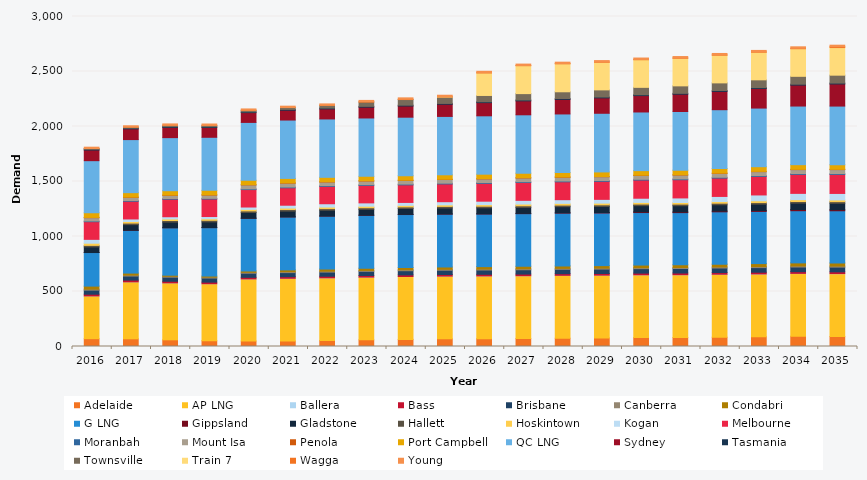
| Category | Adelaide | AP LNG | Ballera | Bass | Brisbane | Canberra | Condabri | G LNG | Gippsland | Gladstone | Hallett | Hoskintown | Kogan | Melbourne | Moranbah | Mount Isa | Penola | Port Campbell | QC LNG | Sydney | Tasmania | Townsville | Train 7 | Wagga | Young |
|---|---|---|---|---|---|---|---|---|---|---|---|---|---|---|---|---|---|---|---|---|---|---|---|---|---|
| 2016.0 | 71.128 | 388.69 | 0.036 | 15.578 | 36.933 | 8.598 | 28.035 | 305.178 | 0.615 | 50.691 | 13.941 | 19.478 | 35.172 | 160.378 | 6.45 | 29.764 | 2.67 | 42.032 | 474.034 | 96.363 | 7.069 | 6.694 | 0 | 0.264 | 12.098 |
| 2017.0 | 70.052 | 517.774 | 0.088 | 15.681 | 36.877 | 8.674 | 18.12 | 389.235 | 0.653 | 50.742 | 14.095 | 14.291 | 23.224 | 160.721 | 6.443 | 29.052 | 2.69 | 40.096 | 482.502 | 97.568 | 7.179 | 8.383 | 0 | 0.291 | 12.197 |
| 2018.0 | 60.738 | 517.774 | 0.192 | 14.18 | 36.972 | 8.682 | 9.488 | 431.486 | 0.745 | 50.889 | 14.281 | 14.006 | 20.159 | 159.018 | 6.444 | 29.368 | 2.746 | 39.168 | 482.502 | 93.028 | 7.205 | 11.841 | 0 | 0.376 | 12.236 |
| 2019.0 | 52.818 | 517.774 | 0.2 | 14.241 | 37.081 | 8.65 | 9.599 | 440.174 | 0.714 | 51.843 | 14.148 | 13.898 | 20.382 | 158.797 | 6.455 | 29.61 | 2.589 | 40.399 | 482.502 | 89.158 | 7.293 | 11.909 | 0 | 0.305 | 12.226 |
| 2020.0 | 49.46 | 564.85 | 0.29 | 14.299 | 37.184 | 8.576 | 11.919 | 479.07 | 0.717 | 52.126 | 14.099 | 13.864 | 21.552 | 158.648 | 6.642 | 35.478 | 2.559 | 39.668 | 526.174 | 89.038 | 7.375 | 13.513 | 0 | 0.362 | 12.185 |
| 2021.0 | 49.825 | 569.66 | 0.597 | 14.325 | 37.27 | 8.48 | 16.32 | 481.446 | 0.762 | 52.366 | 14.101 | 13.593 | 25.641 | 158.374 | 6.823 | 35.424 | 2.571 | 40.543 | 530.596 | 89.114 | 7.453 | 16.818 | 0 | 0.494 | 12.121 |
| 2022.0 | 54.043 | 569.69 | 0.805 | 14.34 | 37.486 | 8.449 | 19.362 | 481.446 | 0.875 | 52.736 | 14.142 | 14.474 | 29.943 | 157.653 | 7.011 | 32.911 | 2.592 | 40.113 | 530.552 | 91.451 | 7.526 | 24.482 | 0 | 1.191 | 12.121 |
| 2023.0 | 60.594 | 569.719 | 0.643 | 14.376 | 37.799 | 8.493 | 19.937 | 481.095 | 1.382 | 53.121 | 14.336 | 14.094 | 30.142 | 158.342 | 7.046 | 33.176 | 2.677 | 40.01 | 530.508 | 98.095 | 7.595 | 38.825 | 0 | 2.933 | 12.183 |
| 2024.0 | 64.68 | 571.273 | 0.446 | 14.485 | 38.191 | 8.587 | 19.563 | 482.383 | 1.619 | 53.506 | 14.405 | 13.997 | 26.513 | 159.604 | 7.084 | 32.959 | 2.688 | 40.738 | 531.883 | 101.483 | 7.66 | 51.2 | 0 | 3.107 | 12.289 |
| 2025.0 | 69.76 | 569.778 | 0.503 | 14.589 | 38.594 | 8.685 | 20.959 | 480.387 | 2.187 | 53.913 | 14.379 | 14.057 | 28.645 | 161.087 | 7.122 | 33.262 | 2.618 | 40.475 | 530.596 | 110.482 | 7.721 | 56.461 | 2.618 | 2.984 | 12.4 |
| 2026.0 | 71.217 | 569.808 | 0.583 | 14.685 | 38.985 | 8.783 | 22.082 | 478.287 | 2.273 | 54.339 | 14.377 | 14.604 | 31.021 | 161.527 | 7.159 | 33.546 | 2.654 | 40.684 | 530.552 | 119.892 | 7.779 | 57.248 | 204.958 | 2.234 | 12.511 |
| 2027.0 | 73.04 | 569.837 | 0.702 | 14.781 | 39.392 | 8.878 | 22.715 | 478.287 | 2.522 | 54.775 | 14.396 | 15.545 | 33.801 | 162.088 | 7.199 | 33.856 | 2.647 | 41.381 | 530.508 | 126.672 | 7.833 | 58.082 | 253.813 | 2.04 | 12.618 |
| 2028.0 | 74.89 | 571.392 | 0.679 | 14.875 | 39.803 | 8.968 | 22.259 | 479.567 | 3.569 | 55.201 | 14.332 | 15.549 | 33.624 | 162.36 | 7.24 | 34.163 | 2.565 | 41.191 | 531.883 | 132.33 | 7.883 | 61.34 | 254.492 | 1.971 | 12.72 |
| 2029.0 | 77.919 | 569.896 | 0.713 | 14.964 | 40.226 | 9.058 | 22.448 | 478.287 | 4.551 | 55.645 | 14.361 | 15.296 | 34.308 | 163.564 | 7.282 | 34.465 | 2.559 | 41.492 | 533.213 | 139.753 | 7.929 | 65.041 | 251.019 | 2.373 | 12.822 |
| 2030.0 | 81.218 | 569.926 | 0.843 | 15.061 | 40.665 | 9.155 | 23.556 | 477.317 | 6.614 | 56.099 | 14.416 | 14.85 | 38.236 | 164.866 | 7.327 | 34.782 | 2.543 | 41.401 | 533.169 | 148.855 | 7.973 | 67.043 | 251.019 | 2.581 | 12.931 |
| 2031.0 | 81.894 | 569.956 | 0.963 | 15.17 | 41.11 | 9.258 | 24.339 | 474.439 | 6.28 | 56.596 | 14.406 | 14.658 | 41.659 | 165.432 | 7.373 | 35.102 | 2.528 | 42.04 | 533.125 | 157.045 | 8.02 | 68.029 | 251.019 | 2.427 | 13.044 |
| 2032.0 | 84.365 | 571.511 | 1.098 | 15.288 | 41.569 | 9.37 | 25.528 | 475.709 | 6.963 | 57.09 | 14.454 | 14.843 | 46.409 | 166.729 | 7.422 | 35.437 | 2.542 | 41.906 | 534.498 | 166.288 | 8.066 | 69.501 | 251.7 | 2.493 | 13.165 |
| 2033.0 | 88.55 | 570.015 | 1.27 | 15.405 | 42.043 | 9.486 | 26.94 | 474.439 | 8.222 | 57.588 | 14.475 | 16.419 | 52.836 | 168.474 | 7.472 | 35.784 | 2.548 | 42.597 | 533.037 | 177.68 | 8.111 | 70.924 | 251.019 | 3.012 | 13.292 |
| 2034.0 | 93.183 | 570.044 | 1.383 | 15.522 | 42.517 | 9.601 | 27.852 | 474.439 | 10.973 | 58.108 | 14.583 | 16.662 | 57.198 | 172.274 | 7.539 | 36.132 | 2.589 | 42.383 | 532.994 | 190.326 | 8.155 | 71.665 | 251.019 | 3.842 | 13.418 |
| 2035.0 | 91.437 | 570.074 | 1.436 | 15.639 | 42.99 | 9.711 | 28.287 | 474.439 | 9.705 | 58.624 | 14.633 | 15.335 | 59.164 | 172.553 | 7.606 | 36.483 | 2.603 | 42.46 | 532.543 | 200.733 | 8.197 | 71.929 | 251.019 | 8.034 | 13.536 |